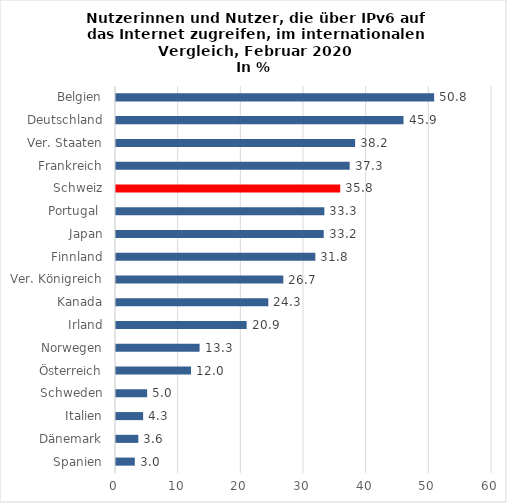
| Category | Series 0 |
|---|---|
| Spanien | 3 |
| Dänemark | 3.56 |
| Italien | 4.33 |
| Schweden | 4.97 |
| Österreich | 11.97 |
| Norwegen | 13.34 |
| Irland | 20.85 |
| Kanada | 24.3 |
| Ver. Königreich | 26.7 |
| Finnland | 31.81 |
| Japan | 33.15 |
| Portugal  | 33.25 |
| Schweiz | 35.78 |
| Frankreich | 37.29 |
| Ver. Staaten | 38.16 |
| Deutschland | 45.88 |
| Belgien | 50.77 |